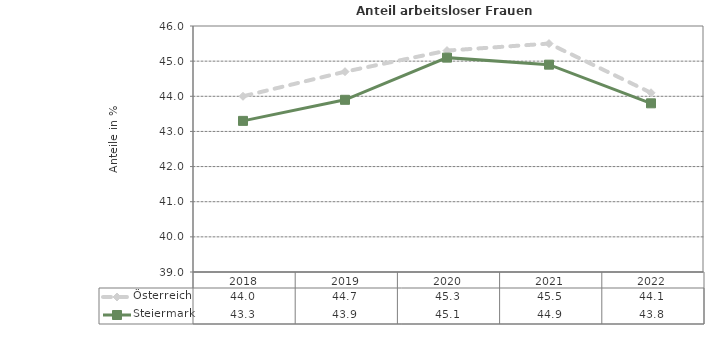
| Category | Österreich | Steiermark |
|---|---|---|
| 2022.0 | 44.1 | 43.8 |
| 2021.0 | 45.5 | 44.9 |
| 2020.0 | 45.3 | 45.1 |
| 2019.0 | 44.7 | 43.9 |
| 2018.0 | 44 | 43.3 |